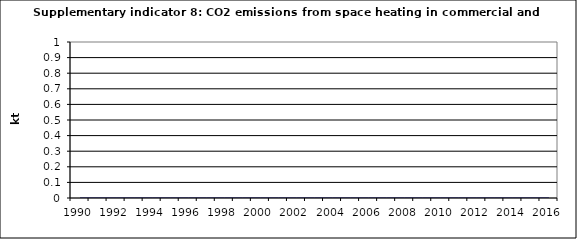
| Category | CO2 emissions from space heating in commercial and institutional, kt |
|---|---|
| 1990 | 0 |
| 1991 | 0 |
| 1992 | 0 |
| 1993 | 0 |
| 1994 | 0 |
| 1995 | 0 |
| 1996 | 0 |
| 1997 | 0 |
| 1998 | 0 |
| 1999 | 0 |
| 2000 | 0 |
| 2001 | 0 |
| 2002 | 0 |
| 2003 | 0 |
| 2004 | 0 |
| 2005 | 0 |
| 2006 | 0 |
| 2007 | 0 |
| 2008 | 0 |
| 2009 | 0 |
| 2010 | 0 |
| 2011 | 0 |
| 2012 | 0 |
| 2013 | 0 |
| 2014 | 0 |
| 2015 | 0 |
| 2016 | 0 |